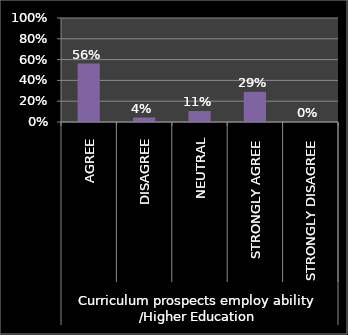
| Category | Series 0 |
|---|---|
| 0 | 0.562 |
| 1 | 0.043 |
| 2 | 0.105 |
| 3 | 0.29 |
| 4 | 0 |